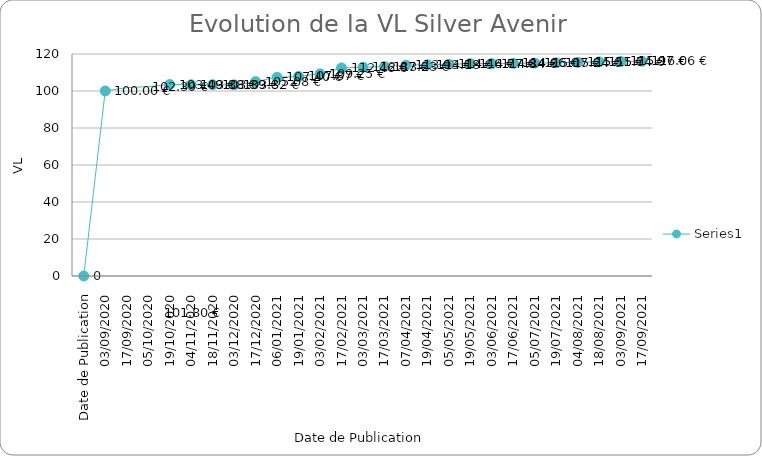
| Category | Series 0 |
|---|---|
| Date de Publication | 0 |
| 03/09/2020 | 100 |
| 17/09/2020 | 101.8 |
| 05/10/2020 | 102.39 |
| 19/10/2020 | 103.49 |
| 04/11/2020 | 103.38 |
| 18/11/2020 | 103.39 |
| 03/12/2020 | 103.32 |
| 17/12/2020 | 105.08 |
| 06/01/2021 | 107.4 |
| 19/01/2021 | 107.87 |
| 03/02/2021 | 109.25 |
| 17/02/2021 | 112.46 |
| 03/03/2021 | 112.87 |
| 17/03/2021 | 113.23 |
| 07/04/2021 | 113.93 |
| 19/04/2021 | 114.18 |
| 05/05/2021 | 114.46 |
| 19/05/2021 | 114.77 |
| 03/06/2021 | 114.84 |
| 17/06/2021 | 114.96 |
| 05/07/2021 | 115.07 |
| 19/07/2021 | 115.24 |
| 04/08/2021 | 115.51 |
| 18/08/2021 | 115.74 |
| 03/09/2021 | 115.97 |
| 17/09/2021 | 116.06 |